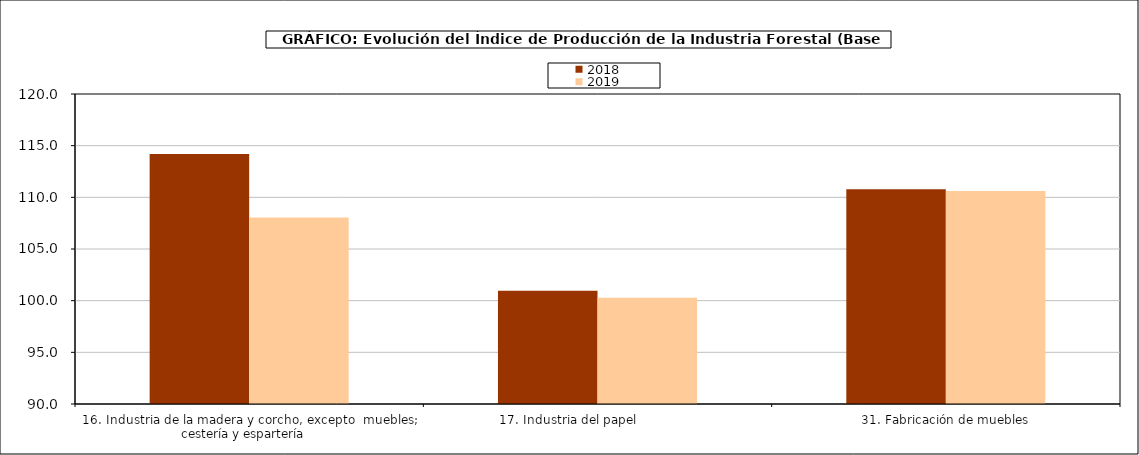
| Category | 2018 | 2019 |
|---|---|---|
| 16. Industria de la madera y corcho, excepto  muebles; cestería y espartería    | 114.2 | 108.052 |
| 17. Industria del papel                | 100.958 | 100.292 |
| 31. Fabricación de muebles | 110.775 | 110.604 |